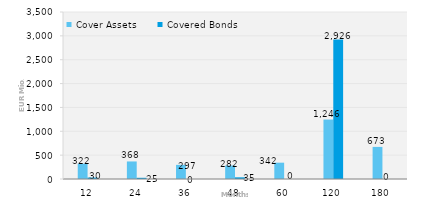
| Category | Cover Assets | Covered Bonds |
|---|---|---|
| 12.0 | 321.815 | 30 |
| 24.0 | 367.712 | 25 |
| 36.0 | 296.513 | 0 |
| 48.0 | 281.946 | 35 |
| 60.0 | 341.99 | 0 |
| 120.0 | 1246.003 | 2926.214 |
| 180.0 | 672.631 | 0 |